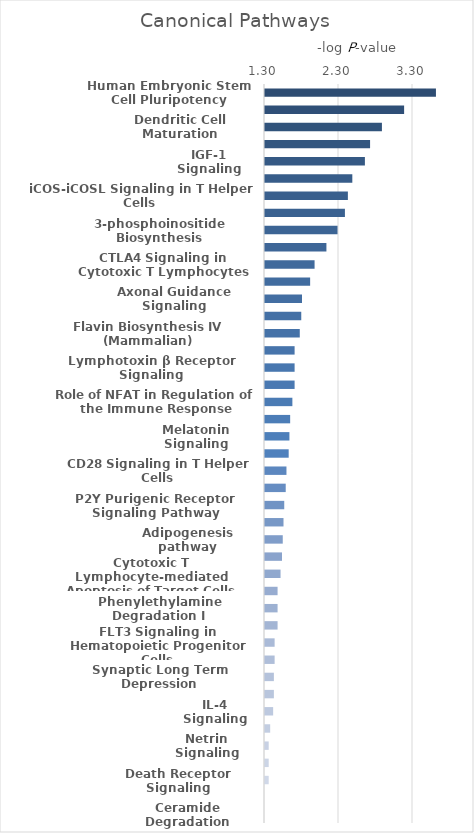
| Category | Canonical Pathways |
|---|---|
| Human Embryonic Stem Cell Pluripotency | 3.61 |
| Sphingosine-1-phosphate Signaling | 3.18 |
| Dendritic Cell Maturation | 2.88 |
| UVA-Induced MAPK Signaling | 2.72 |
| IGF-1 Signaling | 2.65 |
| Superpathway of Inositol Phosphate Compounds | 2.48 |
| iCOS-iCOSL Signaling in T Helper Cells | 2.42 |
| Natural Killer Cell Signaling | 2.38 |
| 3-phosphoinositide Biosynthesis | 2.28 |
| Crosstalk between Dendritic Cells and Natural Killer Cells | 2.13 |
| CTLA4 Signaling in Cytotoxic T Lymphocytes | 1.97 |
| Glucocorticoid Receptor Signaling | 1.91 |
| Axonal Guidance Signaling | 1.8 |
| Phospholipases | 1.79 |
| Flavin Biosynthesis IV (Mammalian) | 1.77 |
| NF-κB Signaling | 1.7 |
| Lymphotoxin β Receptor Signaling | 1.7 |
| Eicosanoid Signaling | 1.7 |
| Role of NFAT in Regulation of the Immune Response | 1.67 |
| Sperm Motility | 1.64 |
| Melatonin Signaling | 1.63 |
| GPCR-Mediated Integration of Enteroendocrine Signaling Exemplified by an L Cell | 1.62 |
| CD28 Signaling in T Helper Cells | 1.59 |
| 14-3-3-mediated Signaling | 1.58 |
| P2Y Purigenic Receptor Signaling Pathway | 1.56 |
| BMP signaling pathway | 1.55 |
| Adipogenesis pathway | 1.54 |
| G-Protein Coupled Receptor Signaling | 1.53 |
| Cytotoxic T Lymphocyte-mediated Apoptosis of Target Cells | 1.51 |
| Uracil Degradation II (Reductive) | 1.47 |
| Phenylethylamine Degradation I | 1.47 |
| Thymine Degradation | 1.47 |
| FLT3 Signaling in Hematopoietic Progenitor Cells | 1.43 |
| GPCR-Mediated Nutrient Sensing in Enteroendocrine Cells | 1.43 |
| Synaptic Long Term Depression | 1.42 |
| D-myo-inositol-5-phosphate Metabolism | 1.42 |
| IL-4 Signaling | 1.41 |
| Galactose Degradation I (Leloir Pathway) | 1.37 |
| Netrin Signaling | 1.35 |
| Factors Promoting Cardiogenesis in Vertebrates | 1.35 |
| Death Receptor Signaling | 1.35 |
| Pyruvate Fermentation to Lactate | 1.3 |
| Ceramide Degradation | 1.3 |